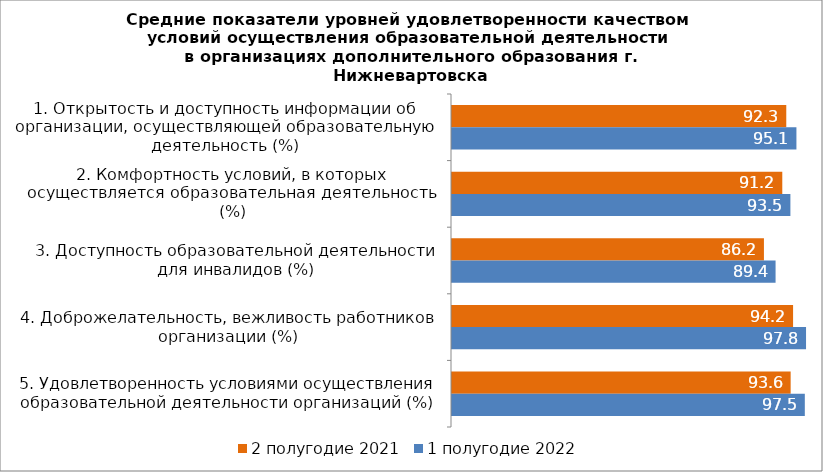
| Category | 2 полугодие 2021 | 1 полугодие 2022 |
|---|---|---|
| 1. Открытость и доступность информации об организации, осуществляющей образовательную деятельность (%) | 92.34 | 95.145 |
| 2. Комфортность условий, в которых осуществляется образовательная деятельность (%) | 91.24 | 93.48 |
| 3. Доступность образовательной деятельности для инвалидов (%) | 86.17 | 89.385 |
| 4. Доброжелательность, вежливость работников организации (%) | 94.22 | 97.8 |
| 5. Удовлетворенность условиями осуществления образовательной деятельности организаций (%) | 93.55 | 97.465 |